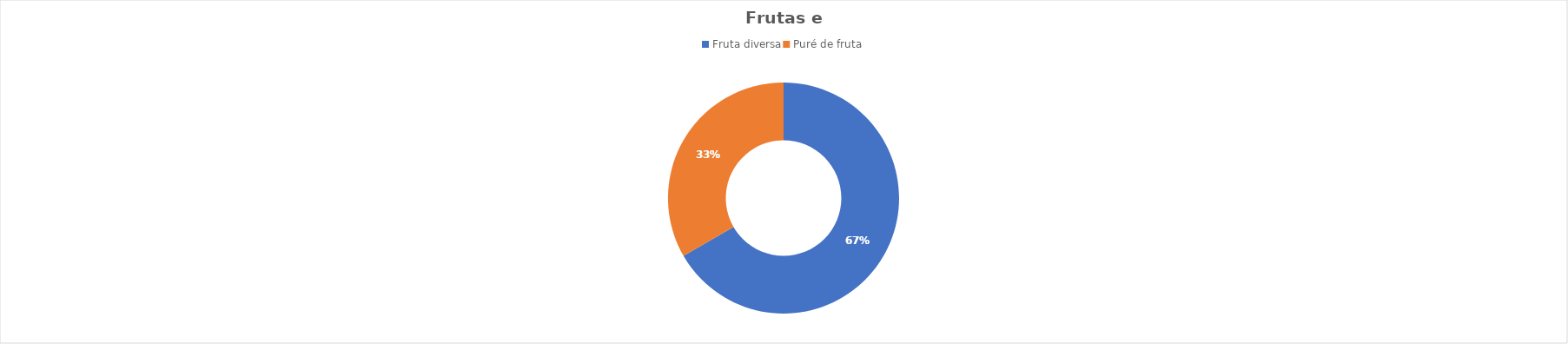
| Category | nº de respostas |
|---|---|
| Fruta diversa | 2 |
| Puré de fruta | 1 |